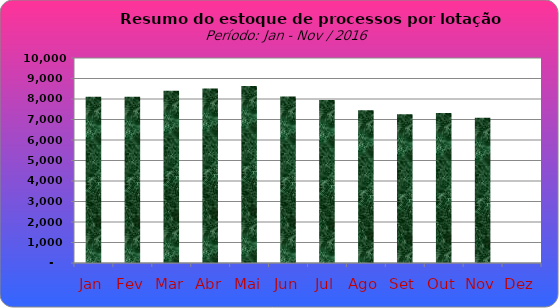
| Category | Series 0 |
|---|---|
| Jan | 8111 |
| Fev | 8114 |
| Mar | 8403 |
| Abr | 8512 |
| Mai | 8633 |
| Jun | 8120 |
| Jul | 7954 |
| Ago | 7447 |
| Set | 7258 |
| Out | 7313 |
| Nov | 7091 |
| Dez | 0 |